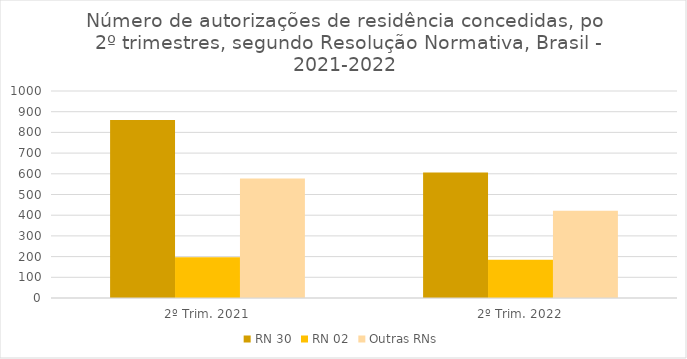
| Category | RN 30 | RN 02 | Outras RNs |
|---|---|---|---|
| 2º Trim. 2021 | 860 | 197 | 577 |
| 2º Trim. 2022 | 606 | 185 | 422 |